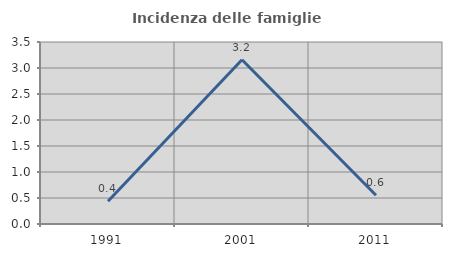
| Category | Incidenza delle famiglie numerose |
|---|---|
| 1991.0 | 0.439 |
| 2001.0 | 3.158 |
| 2011.0 | 0.552 |